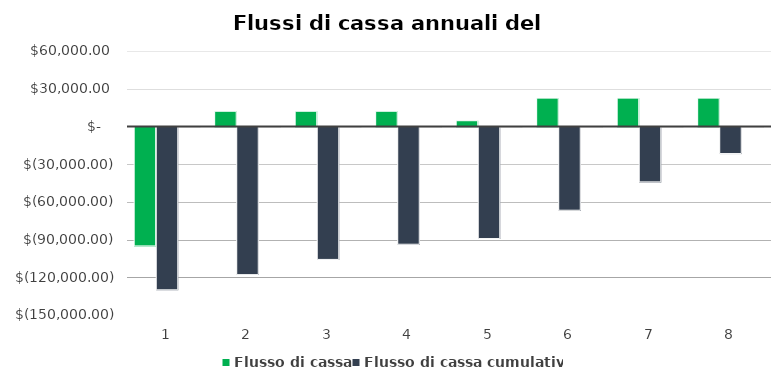
| Category | Flusso di cassa | Flusso di cassa cumulativo | Series 2 |
|---|---|---|---|
| 0 | -94660 | -129560 | 1 |
| 1 | 12080 | -117480 | 2 |
| 2 | 12080 | -105400 | 3 |
| 3 | 12080 | -93320 | 4 |
| 4 | 4532 | -88788 | 5 |
| 5 | 22532 | -66256 | 6 |
| 6 | 22532 | -43724 | 7 |
| 7 | 22532 | -21192 | 8 |